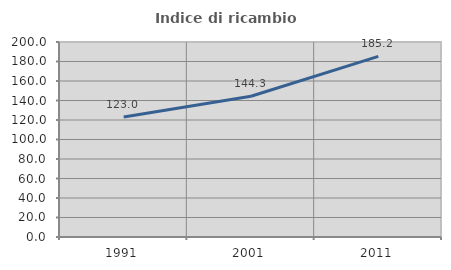
| Category | Indice di ricambio occupazionale  |
|---|---|
| 1991.0 | 123.007 |
| 2001.0 | 144.326 |
| 2011.0 | 185.225 |